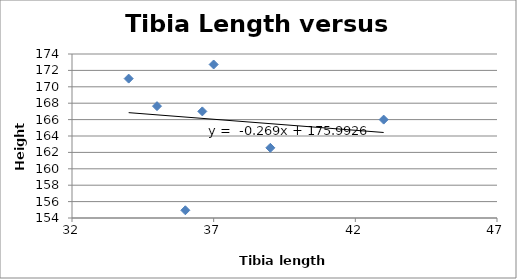
| Category | Series 0 |
|---|---|
| 34.0 | 171 |
| 36.0 | 154.94 |
| 36.6 | 167 |
| 35.0 | 167.64 |
| 37.0 | 172.72 |
| 39.0 | 162.56 |
| 43.0 | 166 |